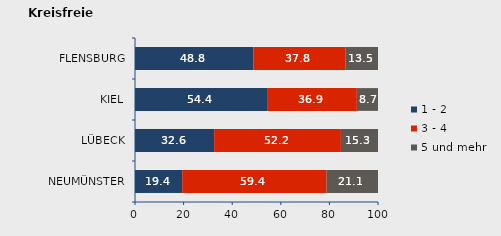
| Category | 1 - 2 | 3 - 4 | 5 und mehr |
|---|---|---|---|
| NEUMÜNSTER | 19.429 | 59.429 | 21.143 |
| LÜBECK | 32.574 | 52.164 | 15.262 |
| KIEL | 54.351 | 36.948 | 8.701 |
| FLENSBURG | 48.785 | 37.757 | 13.458 |